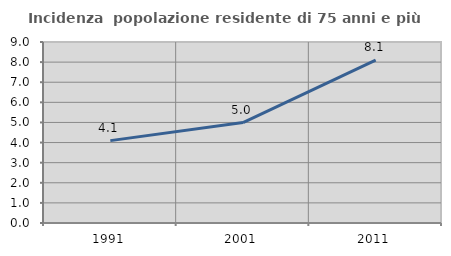
| Category | Incidenza  popolazione residente di 75 anni e più |
|---|---|
| 1991.0 | 4.096 |
| 2001.0 | 4.996 |
| 2011.0 | 8.099 |